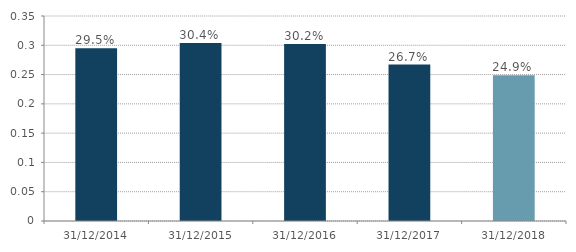
| Category | Series 0 |
|---|---|
| 2014-12-31 | 0.295 |
| 2015-12-31 | 0.304 |
| 2016-12-31 | 0.302 |
| 2017-12-31 | 0.267 |
| 2018-12-31 | 0.249 |